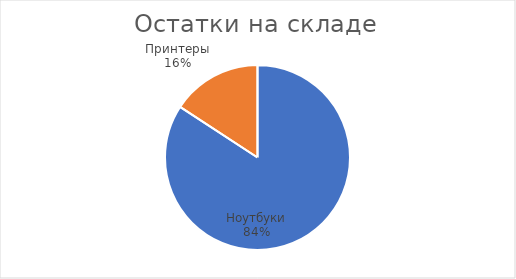
| Category | Текущая сумма |
|---|---|
| Ноутбуки | 115800 |
| Принтеры | 21700 |